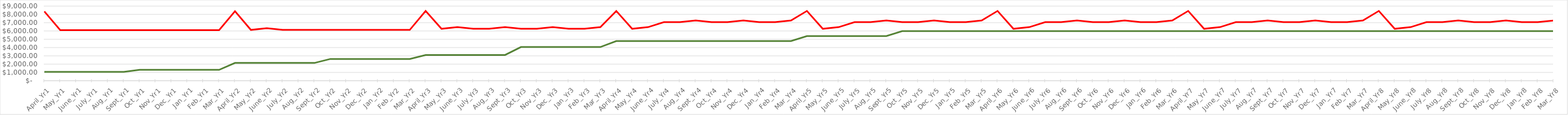
| Category | Total Production | Total Expenses |
|---|---|---|
| April_Yr1 | 1072 | 8354.873 |
| May_Yr1 | 1072 | 6104.873 |
| June_Yr1 | 1072 | 6104.873 |
| July_Yr1 | 1072 | 6104.873 |
| Aug_Yr1 | 1072 | 6104.873 |
| Sept_Yr1 | 1072 | 6104.873 |
| Oct_Yr1 | 1312 | 6104.873 |
| Nov_Yr1 | 1312 | 6104.873 |
| Dec_Yr1 | 1312 | 6104.873 |
| Jan_Yr1 | 1312 | 6104.873 |
| Feb_Yr1 | 1312 | 6104.873 |
| Mar_Yr1 | 1312 | 6104.873 |
| April_Yr2 | 2144 | 8377.373 |
| May_Yr2 | 2144 | 6127.373 |
| June_Yr2 | 2144 | 6327.373 |
| July_Yr2 | 2144 | 6127.373 |
| Aug_Yr2 | 2144 | 6127.373 |
| Sept_Yr2 | 2144 | 6127.373 |
| Oct_Yr2 | 2624 | 6127.373 |
| Nov_Yr2 | 2624 | 6127.373 |
| Dec_Yr2 | 2624 | 6127.373 |
| Jan_Yr2 | 2624 | 6127.373 |
| Feb_Yr2 | 2624 | 6127.373 |
| Mar_Yr2 | 2624 | 6127.373 |
| April_Yr3 | 3104 | 8411.123 |
| May_Yr3 | 3104 | 6261.123 |
| June_Yr3 | 3104 | 6461.123 |
| July_Yr3 | 3104 | 6261.123 |
| Aug_Yr3 | 3104 | 6261.123 |
| Sept_Yr3 | 3104 | 6461.123 |
| Oct_Yr3 | 4064 | 6261.123 |
| Nov_Yr3 | 4064 | 6261.123 |
| Dec_Yr3 | 4064 | 6461.123 |
| Jan_Yr3 | 4064 | 6261.123 |
| Feb_Yr3 | 4064 | 6261.123 |
| Mar_Yr3 | 4064 | 6461.123 |
| April_Yr4 | 4784 | 8411.123 |
| May_Yr4 | 4784 | 6261.123 |
| June_Yr4 | 4784 | 6461.123 |
| July_Yr4 | 4784 | 7061.123 |
| Aug_Yr4 | 4784 | 7061.123 |
| Sept_Yr4 | 4784 | 7261.123 |
| Oct_Yr4 | 4784 | 7061.123 |
| Nov_Yr4 | 4784 | 7061.123 |
| Dec_Yr4 | 4784 | 7261.123 |
| Jan_Yr4 | 4784 | 7061.123 |
| Feb_Yr4 | 4784 | 7061.123 |
| Mar_Yr4 | 4784 | 7261.123 |
| April_Yr5 | 5384 | 8411.123 |
| May_Yr5 | 5384 | 6261.123 |
| June_Yr5 | 5384 | 6461.123 |
| July_Yr5 | 5384 | 7061.123 |
| Aug_Yr5 | 5384 | 7061.123 |
| Sept_Yr5 | 5384 | 7261.123 |
| Oct_Yr5 | 5984 | 7061.123 |
| Nov_Yr5 | 5984 | 7061.123 |
| Dec_Yr5 | 5984 | 7261.123 |
| Jan_Yr5 | 5984 | 7061.123 |
| Feb_Yr5 | 5984 | 7061.123 |
| Mar_Yr5 | 5984 | 7261.123 |
| April_Yr6 | 5984 | 8411.123 |
| May_Yr6 | 5984 | 6261.123 |
| June_Yr6 | 5984 | 6461.123 |
| July_Yr6 | 5984 | 7061.123 |
| Aug_Yr6 | 5984 | 7061.123 |
| Sept_Yr6 | 5984 | 7261.123 |
| Oct_Yr6 | 5984 | 7061.123 |
| Nov_Yr6 | 5984 | 7061.123 |
| Dec_Yr6 | 5984 | 7261.123 |
| Jan_Yr6 | 5984 | 7061.123 |
| Feb_Yr6 | 5984 | 7061.123 |
| Mar_Yr6 | 5984 | 7261.123 |
| April_Yr7 | 5984 | 8411.123 |
| May_Yr7 | 5984 | 6261.123 |
| June_Yr7 | 5984 | 6461.123 |
| July_Yr7 | 5984 | 7061.123 |
| Aug_Yr7 | 5984 | 7061.123 |
| Sept_Yr7 | 5984 | 7261.123 |
| Oct_Yr7 | 5984 | 7061.123 |
| Nov_Yr7 | 5984 | 7061.123 |
| Dec_Yr7 | 5984 | 7261.123 |
| Jan_Yr7 | 5984 | 7061.123 |
| Feb_Yr7 | 5984 | 7061.123 |
| Mar_Yr7 | 5984 | 7261.123 |
| April_Yr8 | 5984 | 8411.123 |
| May_Yr8 | 5984 | 6261.123 |
| June_Yr8 | 5984 | 6461.123 |
| July_Yr8 | 5984 | 7061.123 |
| Aug_Yr8 | 5984 | 7061.123 |
| Sept_Yr8 | 5984 | 7261.123 |
| Oct_Yr8 | 5984 | 7061.123 |
| Nov_Yr8 | 5984 | 7061.123 |
| Dec_Yr8 | 5984 | 7261.123 |
| Jan_Yr8 | 5984 | 7061.123 |
| Feb_Yr8 | 5984 | 7061.123 |
| Mar_Yr8 | 5984 | 7261.123 |